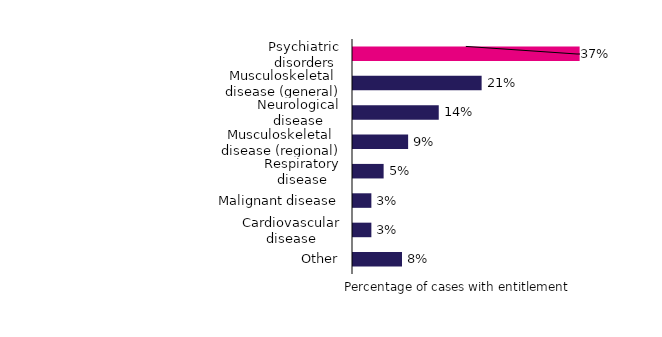
| Category | Percentage of cases |
|---|---|
| Psychiatric disorders | 0.37 |
| Musculoskeletal disease (general) | 0.21 |
| Neurological disease | 0.14 |
| Musculoskeletal disease (regional) | 0.09 |
| Respiratory disease | 0.05 |
| Malignant disease | 0.03 |
| Cardiovascular disease | 0.03 |
| Other | 0.08 |